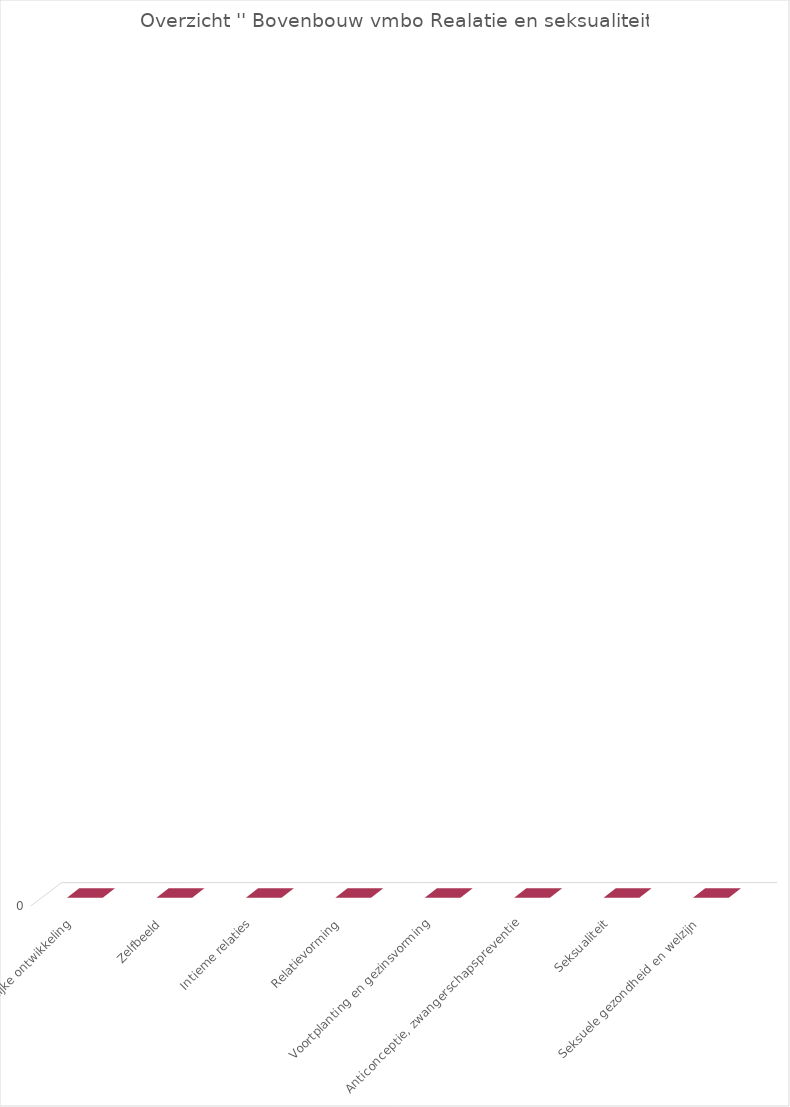
| Category | Series 2 |
|---|---|
| Lichamelijke ontwikkeling | 0 |
| Zelfbeeld | 0 |
| Intieme relaties | 0 |
| Relatievorming | 0 |
| Voortplanting en gezinsvorming | 0 |
| Anticonceptie, zwangerschapspreventie | 0 |
| Seksualiteit | 0 |
| Seksuele gezondheid en welzijn | 0 |